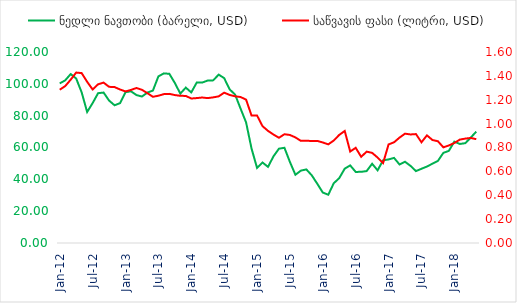
| Category | ნედლი ნავთობი (ბარელი, USD) |
|---|---|
| 2012-01-01 | 100.274 |
| 2012-02-01 | 102.204 |
| 2012-03-01 | 106.158 |
| 2012-04-01 | 103.321 |
| 2012-05-01 | 94.655 |
| 2012-06-01 | 82.303 |
| 2012-07-01 | 87.895 |
| 2012-08-01 | 94.131 |
| 2012-09-01 | 94.514 |
| 2012-10-01 | 89.491 |
| 2012-11-01 | 86.531 |
| 2012-12-01 | 87.86 |
| 2013-01-01 | 94.757 |
| 2013-02-01 | 95.309 |
| 2013-03-01 | 92.938 |
| 2013-04-01 | 92.021 |
| 2013-05-01 | 94.51 |
| 2013-06-01 | 95.772 |
| 2013-07-01 | 104.671 |
| 2013-08-01 | 106.573 |
| 2013-09-01 | 106.29 |
| 2013-10-01 | 100.538 |
| 2013-11-01 | 93.864 |
| 2013-12-01 | 97.625 |
| 2014-01-01 | 94.617 |
| 2014-02-01 | 100.817 |
| 2014-03-01 | 100.804 |
| 2014-04-01 | 102.069 |
| 2014-05-01 | 102.177 |
| 2014-06-01 | 105.794 |
| 2014-07-01 | 103.589 |
| 2014-08-01 | 96.536 |
| 2014-09-01 | 93.212 |
| 2014-10-01 | 84.397 |
| 2014-11-01 | 75.789 |
| 2014-12-01 | 59.29 |
| 2015-01-01 | 47.219 |
| 2015-02-01 | 50.584 |
| 2015-03-01 | 47.824 |
| 2015-04-01 | 54.453 |
| 2015-05-01 | 59.265 |
| 2015-06-01 | 59.82 |
| 2015-07-01 | 50.901 |
| 2015-08-01 | 42.868 |
| 2015-09-01 | 45.48 |
| 2015-10-01 | 46.224 |
| 2015-11-01 | 42.444 |
| 2015-12-01 | 37.189 |
| 2016-01-01 | 31.683 |
| 2016-02-01 | 30.323 |
| 2016-03-01 | 37.546 |
| 2016-04-01 | 40.755 |
| 2016-05-01 | 46.712 |
| 2016-06-01 | 48.757 |
| 2016-07-01 | 44.652 |
| 2016-08-01 | 44.724 |
| 2016-09-01 | 45.182 |
| 2016-10-01 | 49.775 |
| 2016-11-01 | 45.661 |
| 2016-12-01 | 51.97 |
| 2017-01-01 | 52.504 |
| 2017-02-01 | 53.468 |
| 2017-03-01 | 49.328 |
| 2017-04-01 | 51.061 |
| 2017-05-01 | 48.476 |
| 2017-06-01 | 45.178 |
| 2017-07-01 | 46.631 |
| 2017-08-01 | 48.037 |
| 2017-09-01 | 49.822 |
| 2017-10-01 | 51.578 |
| 2017-11-01 | 56.639 |
| 2017-12-01 | 57.882 |
| 2018-01-01 | 63.699 |
| 2018-02-01 | 62.229 |
| 2018-03-01 | 62.725 |
| 2018-04-01 | 66.254 |
| 2018-05-01 | 69.978 |